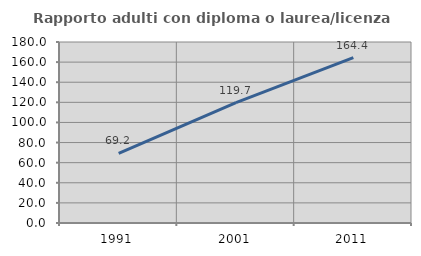
| Category | Rapporto adulti con diploma o laurea/licenza media  |
|---|---|
| 1991.0 | 69.231 |
| 2001.0 | 119.737 |
| 2011.0 | 164.368 |